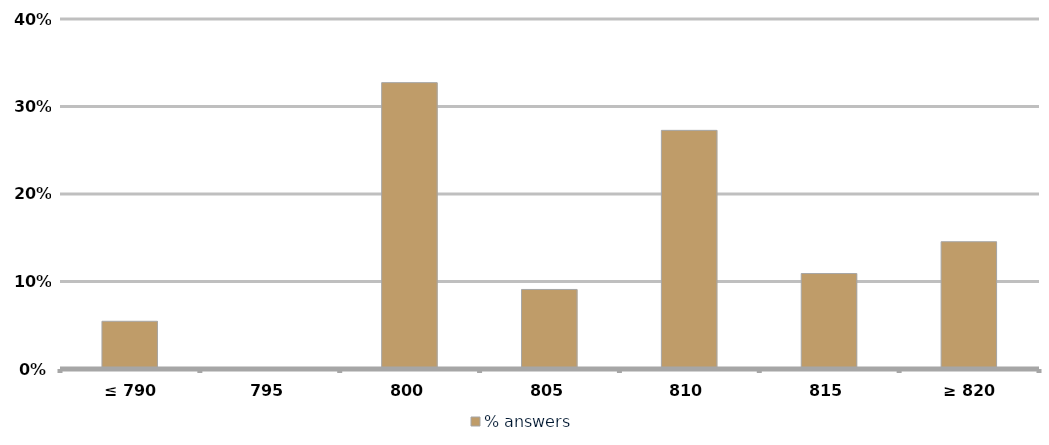
| Category | % answers |
|---|---|
| ≤ 790 | 0.055 |
| 795 | 0 |
| 800 | 0.327 |
| 805 | 0.091 |
| 810 | 0.273 |
| 815 | 0.109 |
| ≥ 820 | 0.145 |